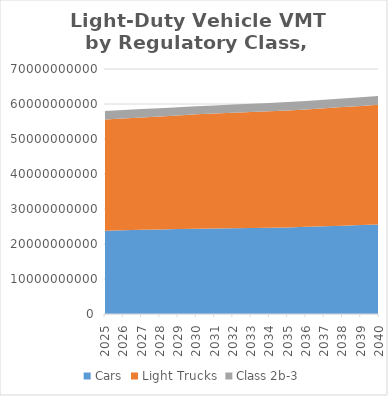
| Category | Cars | Light Trucks | Class 2b-3 |
|---|---|---|---|
| 2025.0 | 23810124819.5 | 31778692267.279 | 2402351507.692 |
| 2026.0 | 23924284890 | 31954800151.064 | 2386081622.154 |
| 2027.0 | 24038444960.5 | 32130908034.848 | 2369811736.615 |
| 2028.0 | 24152605031 | 32307015918.633 | 2353541851.077 |
| 2029.0 | 24266765101.5 | 32483123802.418 | 2337271965.538 |
| 2030.0 | 24380925172 | 32659231686.203 | 2321002080 |
| 2031.0 | 24450139140.661 | 32808139653.02 | 2338905649.352 |
| 2032.0 | 24519353109.322 | 32957047619.837 | 2356809218.705 |
| 2033.0 | 24588567077.982 | 33105955586.653 | 2374712788.057 |
| 2034.0 | 24657781046.643 | 33254863553.47 | 2392616357.409 |
| 2035.0 | 24726995015.304 | 33403771520.287 | 2410519926.762 |
| 2036.0 | 24899136760.281 | 33563757319.578 | 2428727167.009 |
| 2037.0 | 25071278505.258 | 33723743118.869 | 2446934407.257 |
| 2038.0 | 25243420250.234 | 33883728918.16 | 2465141647.505 |
| 2039.0 | 25415561995.211 | 34043714717.451 | 2483348887.752 |
| 2040.0 | 25587703740.188 | 34203700516.742 | 2501556128 |